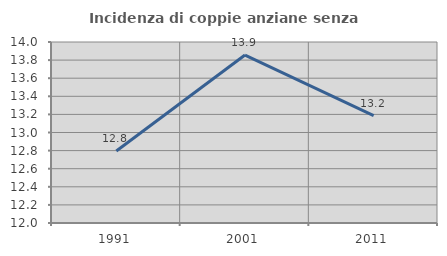
| Category | Incidenza di coppie anziane senza figli  |
|---|---|
| 1991.0 | 12.795 |
| 2001.0 | 13.856 |
| 2011.0 | 13.186 |